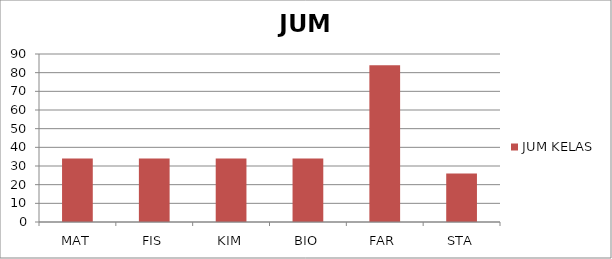
| Category | JUM KELAS |
|---|---|
| MAT | 34 |
| FIS | 34 |
| KIM | 34 |
| BIO | 34 |
| FAR | 84 |
| STA | 26 |